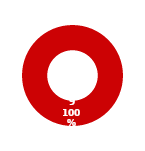
| Category | WM |
|---|---|
| MIL 2 Complete | 0 |
| MIL 2 Not Complete | 9 |